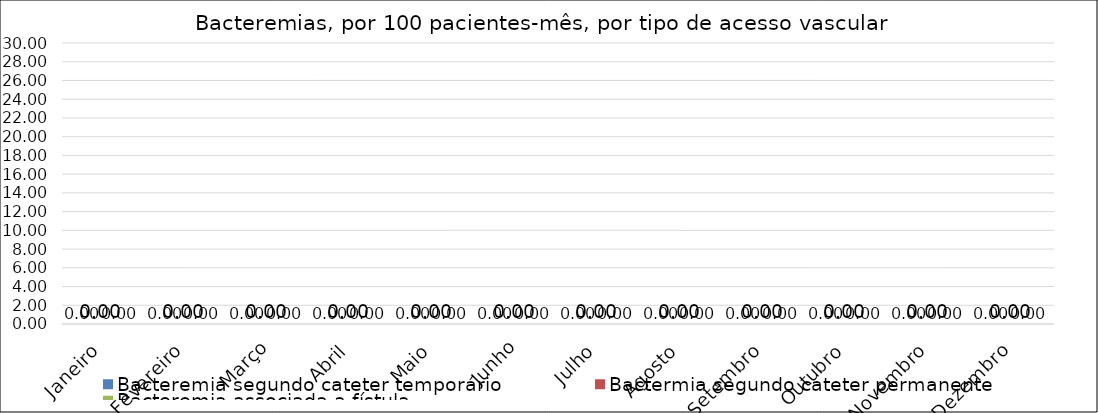
| Category | Bacteremia segundo cateter temporário | Bactermia segundo cateter permanente | Bacteremia associada a fístula |
|---|---|---|---|
| Janeiro | 0 | 0 | 0 |
| Fevereiro | 0 | 0 | 0 |
| Março | 0 | 0 | 0 |
| Abril | 0 | 0 | 0 |
| Maio | 0 | 0 | 0 |
| Junho | 0 | 0 | 0 |
| Julho | 0 | 0 | 0 |
| Agosto | 0 | 0 | 0 |
| Setembro | 0 | 0 | 0 |
| Outubro | 0 | 0 | 0 |
| Novembro | 0 | 0 | 0 |
| Dezembro | 0 | 0 | 0 |